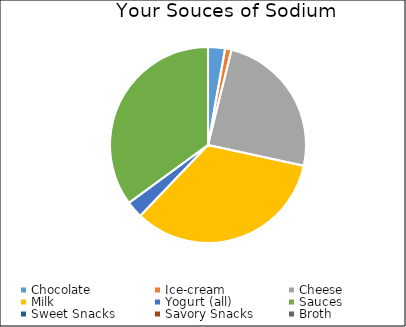
| Category | Series 0 |
|---|---|
| Chocolate | 40 |
| Ice-cream | 15 |
| Cheese | 350 |
| Milk | 481.5 |
| Yogurt (all) | 40 |
| Sauces | 500 |
| Sweet Snacks | 0 |
| Savory Snacks | 0 |
| Broth | 0 |